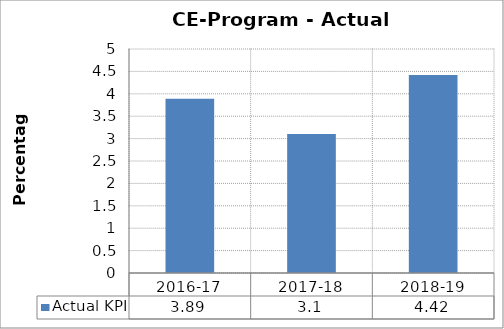
| Category | Actual KPI |
|---|---|
| 2016-17 | 3.89 |
| 2017-18 | 3.1 |
| 2018-19 | 4.42 |